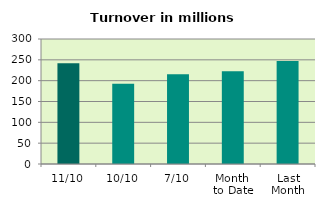
| Category | Series 0 |
|---|---|
| 11/10 | 241.653 |
| 10/10 | 192.35 |
| 7/10 | 215.347 |
| Month 
to Date | 222.724 |
| Last
Month | 247.353 |